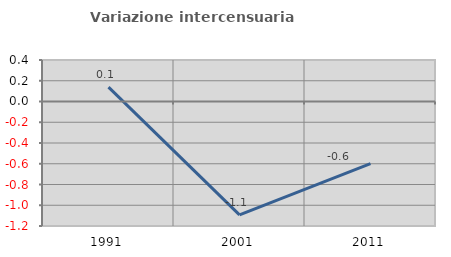
| Category | Variazione intercensuaria annua |
|---|---|
| 1991.0 | 0.139 |
| 2001.0 | -1.092 |
| 2011.0 | -0.599 |